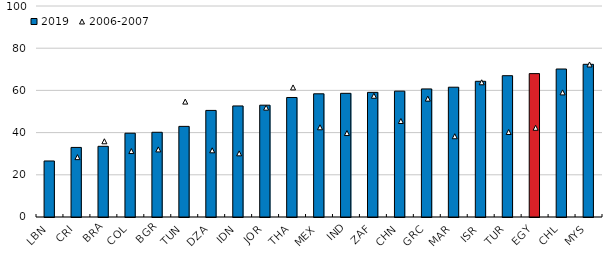
| Category | 2019 |
|---|---|
| LBN | 26.553 |
| CRI | 32.971 |
| BRA | 33.5 |
| COL | 39.713 |
| BGR | 40.154 |
| TUN | 42.944 |
| DZA | 50.516 |
| IDN | 52.633 |
| JOR | 52.997 |
| THA | 56.639 |
| MEX | 58.388 |
| IND | 58.616 |
| ZAF | 59.075 |
| CHN | 59.655 |
| GRC | 60.696 |
| MAR | 61.508 |
| ISR | 64.32 |
| TUR | 66.97 |
| EGY | 67.956 |
| CHL | 70.137 |
| MYS | 72.37 |